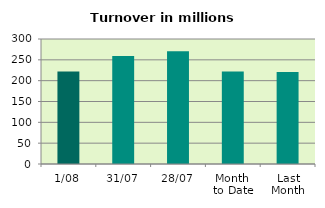
| Category | Series 0 |
|---|---|
| 1/08 | 222.256 |
| 31/07 | 259.218 |
| 28/07 | 270.532 |
| Month 
to Date | 222.256 |
| Last
Month | 220.762 |